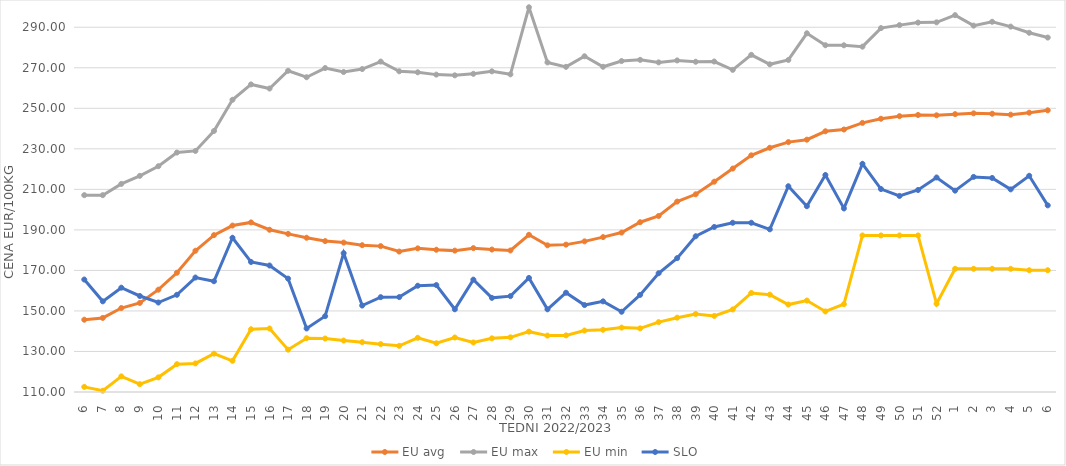
| Category | EU avg | EU max | EU min | SLO |
|---|---|---|---|---|
| 6.0 | 145.677 | 207.14 | 112.52 | 165.51 |
| 7.0 | 146.556 | 207.14 | 110.619 | 154.74 |
| 8.0 | 151.439 | 212.7 | 117.709 | 161.48 |
| 9.0 | 153.947 | 216.67 | 113.871 | 157.38 |
| 10.0 | 160.496 | 221.43 | 117.233 | 154.16 |
| 11.0 | 168.845 | 228.17 | 123.737 | 157.96 |
| 12.0 | 179.714 | 228.97 | 124.105 | 166.49 |
| 13.0 | 187.409 | 238.81 | 128.918 | 164.66 |
| 14.0 | 192.137 | 254.21 | 125.399 | 186.11 |
| 15.0 | 193.697 | 261.79 | 140.954 | 174.18 |
| 16.0 | 190.066 | 259.76 | 141.337 | 172.42 |
| 17.0 | 188.031 | 268.52 | 130.897 | 165.96 |
| 18.0 | 186.119 | 265.34 | 136.529 | 141.36 |
| 19.0 | 184.47 | 269.87 | 136.387 | 147.43 |
| 20.0 | 183.734 | 267.92 | 135.392 | 178.51 |
| 21.0 | 182.45 | 269.38 | 134.589 | 152.67 |
| 22.0 | 181.991 | 273.06 | 133.621 | 156.8 |
| 23.0 | 179.308 | 268.27 | 132.787 | 156.84 |
| 24.0 | 180.886 | 267.77 | 136.75 | 162.44 |
| 25.0 | 180.2 | 266.63 | 134.058 | 162.78 |
| 26.0 | 179.77 | 266.27 | 136.895 | 150.82 |
| 27.0 | 180.992 | 267.02 | 134.44 | 165.45 |
| 28.0 | 180.305 | 268.25 | 136.486 | 156.46 |
| 29.0 | 179.847 | 266.77 | 136.97 | 157.31 |
| 30.0 | 187.576 | 299.87 | 139.777 | 166.29 |
| 31.0 | 182.385 | 272.64 | 137.828 | 150.81 |
| 32.0 | 182.73 | 270.47 | 137.934 | 158.99 |
| 33.0 | 184.343 | 275.68 | 140.33 | 152.91 |
| 34.0 | 186.448 | 270.49 | 140.7 | 154.73 |
| 35.0 | 188.684 | 273.33 | 141.78 | 149.6 |
| 36.0 | 193.792 | 273.91 | 141.41 | 157.93 |
| 37.0 | 196.877 | 272.67 | 144.47 | 168.61 |
| 38.0 | 203.962 | 273.63 | 146.68 | 176.07 |
| 39.0 | 207.574 | 272.98 | 148.499 | 186.86 |
| 40.0 | 213.785 | 273.1 | 147.54 | 191.45 |
| 41.0 | 220.272 | 268.98 | 150.75 | 193.52 |
| 42.0 | 226.803 | 276.39 | 158.87 | 193.52 |
| 43.0 | 230.521 | 271.72 | 158.04 | 190.28 |
| 44.0 | 233.325 | 273.856 | 153.16 | 211.53 |
| 45.0 | 234.517 | 287.021 | 155.13 | 201.69 |
| 46.0 | 238.669 | 281.133 | 149.75 | 217.08 |
| 47.0 | 239.534 | 281.102 | 153.36 | 200.62 |
| 48.0 | 242.81 | 280.434 | 187.26 | 222.61 |
| 49.0 | 244.854 | 289.585 | 187.26 | 210.16 |
| 50.0 | 246.132 | 291.057 | 187.26 | 206.76 |
| 51.0 | 246.705 | 292.307 | 187.26 | 209.69 |
| 52.0 | 246.546 | 292.426 | 153.54 | 215.87 |
| 1.0 | 247.118 | 295.98 | 170.79 | 209.37 |
| 2.0 | 247.516 | 290.8 | 170.79 | 216.15 |
| 3.0 | 247.327 | 292.71 | 170.79 | 215.63 |
| 4.0 | 246.864 | 290.32 | 170.79 | 210 |
| 5.0 | 247.838 | 287.27 | 170.09 | 216.7 |
| 6.0 | 249.019 | 284.92 | 170.09 | 202.1 |